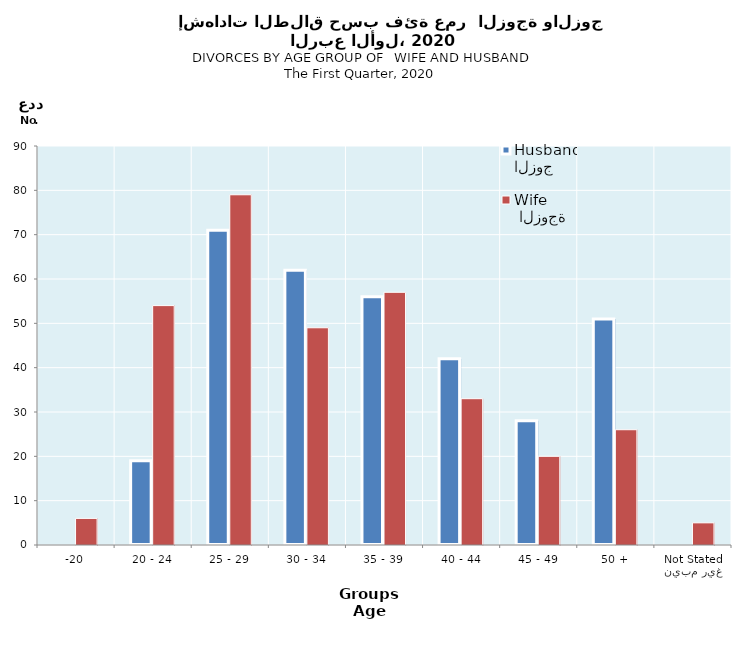
| Category | الزوج
Husband |  الزوجة
Wife |
|---|---|---|
| -20 | 0 | 6 |
| 20 - 24 | 19 | 54 |
| 25 - 29 | 71 | 79 |
| 30 - 34 | 62 | 49 |
| 35 - 39 | 56 | 57 |
| 40 - 44 | 42 | 33 |
| 45 - 49 | 28 | 20 |
| 50 + | 51 | 26 |
| غير مبين
Not Stated | 0 | 5 |